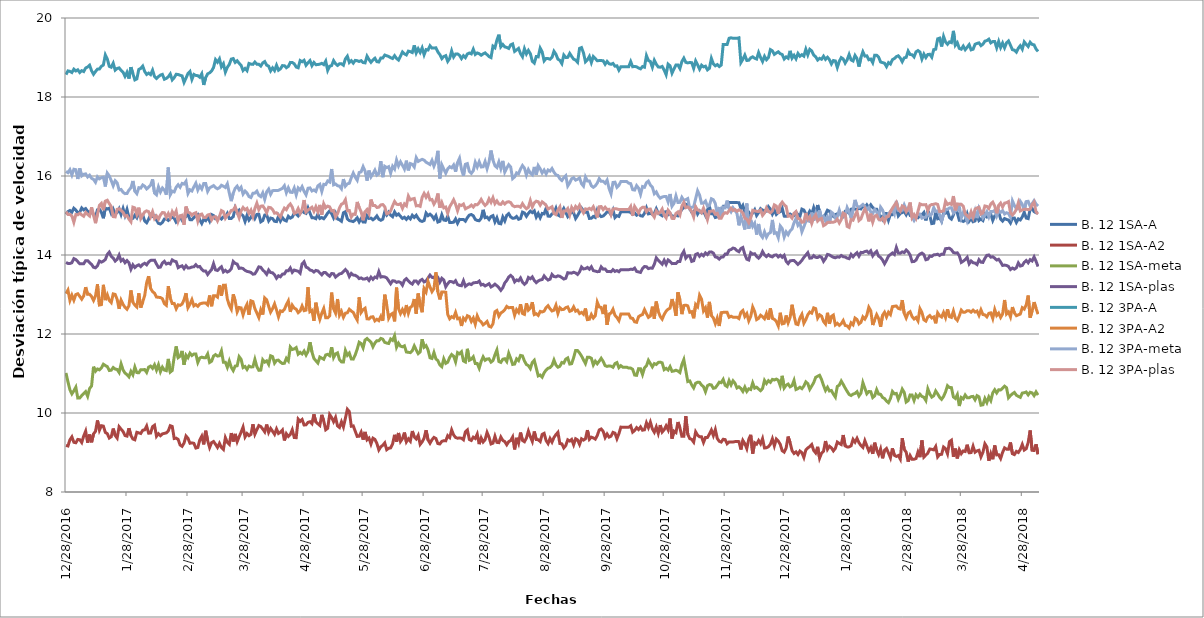
| Category | B. 12 1SA-A | B. 12 1SA-A2 | B. 12 1SA-meta | B. 12 1SA-plas | B. 12 3PA-A | B. 12 3PA-A2 | B. 12 3PA-meta | B. 12 3PA-plas |
|---|---|---|---|---|---|---|---|---|
| 28/12/2016 | 15.03 | 9.18 | 11.014 | 13.813 | 18.568 | 13.023 | 16.117 | 15.097 |
| 29/12/2016 | 15.1 | 9.165 | 10.789 | 13.787 | 18.661 | 13.112 | 16.084 | 15.027 |
| 30/12/2016 | 15.126 | 9.319 | 10.587 | 13.785 | 18.65 | 12.85 | 16.158 | 15.028 |
| 31/12/2016 | 15.083 | 9.395 | 10.484 | 13.805 | 18.62 | 12.982 | 16.026 | 14.99 |
| 01/01/2017 | 15.183 | 9.258 | 10.562 | 13.908 | 18.705 | 12.856 | 16.171 | 14.828 |
| 02/01/2017 | 15.139 | 9.247 | 10.653 | 13.883 | 18.659 | 13 | 16.16 | 15.024 |
| 03/01/2017 | 15.066 | 9.331 | 10.378 | 13.832 | 18.689 | 13.019 | 15.925 | 15.016 |
| 04/01/2017 | 15.085 | 9.324 | 10.381 | 13.778 | 18.619 | 12.952 | 16.193 | 15.057 |
| 05/01/2017 | 15.192 | 9.254 | 10.44 | 13.776 | 18.667 | 12.881 | 16.003 | 15.015 |
| 06/01/2017 | 15.142 | 9.416 | 10.491 | 13.778 | 18.644 | 12.964 | 16.042 | 14.981 |
| 07/01/2017 | 15.175 | 9.54 | 10.54 | 13.857 | 18.733 | 13.185 | 16.053 | 15.077 |
| 08/01/2017 | 15.107 | 9.248 | 10.423 | 13.855 | 18.76 | 13.004 | 15.976 | 15.027 |
| 09/01/2017 | 15.071 | 9.455 | 10.618 | 13.806 | 18.805 | 13.006 | 16.02 | 14.986 |
| 10/01/2017 | 15.12 | 9.258 | 10.686 | 13.762 | 18.665 | 12.95 | 15.942 | 15.208 |
| 11/01/2017 | 15.014 | 9.469 | 11.172 | 13.689 | 18.575 | 12.849 | 15.915 | 15.005 |
| 12/01/2017 | 14.963 | 9.536 | 11.058 | 13.675 | 18.645 | 12.964 | 15.842 | 14.806 |
| 13/01/2017 | 15.145 | 9.812 | 11.115 | 13.729 | 18.706 | 13.26 | 15.979 | 15.033 |
| 14/01/2017 | 15.158 | 9.564 | 11.092 | 13.848 | 18.709 | 12.733 | 15.929 | 15.255 |
| 15/01/2017 | 15.081 | 9.678 | 11.142 | 13.82 | 18.778 | 12.744 | 15.958 | 15.305 |
| 16/01/2017 | 14.93 | 9.668 | 11.234 | 13.846 | 18.809 | 13.245 | 15.97 | 15.135 |
| 17/01/2017 | 15.188 | 9.509 | 11.201 | 13.885 | 19.065 | 12.858 | 15.734 | 15.364 |
| 18/01/2017 | 15.165 | 9.476 | 11.175 | 14.014 | 18.964 | 12.993 | 16.073 | 15.386 |
| 19/01/2017 | 15.186 | 9.366 | 11.076 | 14.073 | 18.776 | 12.851 | 16.002 | 15.302 |
| 20/01/2017 | 15.054 | 9.399 | 11.084 | 13.965 | 18.753 | 12.796 | 15.884 | 15.224 |
| 21/01/2017 | 15.16 | 9.606 | 11.152 | 13.923 | 18.855 | 13.015 | 15.753 | 14.972 |
| 22/01/2017 | 15.033 | 9.432 | 11.112 | 13.846 | 18.68 | 13.002 | 15.88 | 14.965 |
| 23/01/2017 | 15.075 | 9.365 | 11.103 | 13.891 | 18.723 | 12.877 | 15.828 | 15.156 |
| 24/01/2017 | 15.17 | 9.652 | 11.027 | 13.997 | 18.737 | 12.636 | 15.646 | 15.171 |
| 25/01/2017 | 15.025 | 9.591 | 11.242 | 13.85 | 18.675 | 12.856 | 15.659 | 15.128 |
| 26/01/2017 | 15.177 | 9.531 | 11.092 | 13.889 | 18.628 | 12.751 | 15.588 | 15.083 |
| 27/01/2017 | 15.003 | 9.429 | 11.01 | 13.805 | 18.523 | 12.674 | 15.554 | 14.982 |
| 28/01/2017 | 15.154 | 9.415 | 10.972 | 13.859 | 18.625 | 12.626 | 15.555 | 14.999 |
| 29/01/2017 | 14.948 | 9.615 | 10.916 | 13.804 | 18.466 | 12.716 | 15.646 | 14.907 |
| 30/01/2017 | 14.908 | 9.431 | 11.054 | 13.64 | 18.754 | 13.103 | 15.699 | 14.841 |
| 31/01/2017 | 14.928 | 9.341 | 10.967 | 13.751 | 18.593 | 12.804 | 15.874 | 15.21 |
| 01/02/2017 | 15.007 | 9.322 | 11.163 | 13.683 | 18.432 | 12.732 | 15.615 | 15.193 |
| 02/02/2017 | 14.942 | 9.511 | 11.023 | 13.728 | 18.457 | 12.684 | 15.554 | 15.029 |
| 03/02/2017 | 15.068 | 9.497 | 11.018 | 13.751 | 18.697 | 13.031 | 15.705 | 15.199 |
| 04/02/2017 | 14.97 | 9.482 | 11.096 | 13.707 | 18.724 | 12.668 | 15.694 | 14.922 |
| 05/02/2017 | 15.016 | 9.563 | 11.097 | 13.763 | 18.783 | 12.813 | 15.773 | 15.01 |
| 06/02/2017 | 14.863 | 9.574 | 11.099 | 13.791 | 18.647 | 12.975 | 15.74 | 15.091 |
| 07/02/2017 | 14.816 | 9.67 | 11.027 | 13.751 | 18.571 | 13.302 | 15.672 | 15.117 |
| 08/02/2017 | 14.907 | 9.488 | 11.161 | 13.823 | 18.605 | 13.462 | 15.715 | 15.097 |
| 09/02/2017 | 15.022 | 9.493 | 11.188 | 13.864 | 18.567 | 13.156 | 15.765 | 14.967 |
| 10/02/2017 | 14.976 | 9.654 | 11.131 | 13.868 | 18.68 | 13.072 | 15.915 | 15.096 |
| 11/02/2017 | 14.997 | 9.69 | 11.221 | 13.87 | 18.52 | 13.034 | 15.568 | 14.922 |
| 12/02/2017 | 14.887 | 9.411 | 11.086 | 13.77 | 18.47 | 12.936 | 15.524 | 14.986 |
| 13/02/2017 | 14.8 | 9.476 | 11.221 | 13.685 | 18.516 | 12.929 | 15.725 | 14.905 |
| 14/02/2017 | 14.785 | 9.425 | 11.044 | 13.693 | 18.554 | 12.924 | 15.597 | 15.012 |
| 15/02/2017 | 14.824 | 9.472 | 11.16 | 13.796 | 18.573 | 12.894 | 15.697 | 15.076 |
| 16/02/2017 | 14.911 | 9.484 | 11.086 | 13.84 | 18.449 | 12.769 | 15.644 | 15.069 |
| 17/02/2017 | 14.908 | 9.497 | 11.072 | 13.772 | 18.472 | 12.727 | 15.527 | 14.954 |
| 18/02/2017 | 14.875 | 9.548 | 11.37 | 13.793 | 18.511 | 13.21 | 16.214 | 15.05 |
| 19/02/2017 | 14.93 | 9.679 | 11.036 | 13.772 | 18.582 | 12.908 | 15.525 | 14.943 |
| 20/02/2017 | 14.955 | 9.66 | 11.076 | 13.875 | 18.434 | 12.771 | 15.617 | 15.098 |
| 21/02/2017 | 14.933 | 9.354 | 11.424 | 13.844 | 18.49 | 12.774 | 15.597 | 15.009 |
| 22/02/2017 | 14.831 | 9.364 | 11.686 | 13.83 | 18.575 | 12.64 | 15.717 | 15.114 |
| 23/02/2017 | 14.874 | 9.331 | 11.402 | 13.68 | 18.57 | 12.739 | 15.779 | 14.857 |
| 24/02/2017 | 14.962 | 9.19 | 11.438 | 13.708 | 18.55 | 12.725 | 15.716 | 14.992 |
| 25/02/2017 | 14.88 | 9.156 | 11.571 | 13.726 | 18.535 | 12.757 | 15.812 | 15.009 |
| 26/02/2017 | 14.948 | 9.238 | 11.221 | 13.655 | 18.37 | 12.866 | 15.795 | 14.765 |
| 27/02/2017 | 14.973 | 9.417 | 11.464 | 13.728 | 18.48 | 13.033 | 15.865 | 15.226 |
| 28/02/2017 | 15.037 | 9.36 | 11.401 | 13.67 | 18.595 | 12.667 | 15.558 | 15.083 |
| 01/03/2017 | 14.895 | 9.234 | 11.514 | 13.675 | 18.647 | 12.755 | 15.651 | 15.065 |
| 02/03/2017 | 14.894 | 9.244 | 11.455 | 13.696 | 18.446 | 12.869 | 15.622 | 15.006 |
| 03/03/2017 | 14.946 | 9.233 | 11.492 | 13.702 | 18.572 | 12.711 | 15.724 | 15.051 |
| 04/03/2017 | 14.988 | 9.113 | 11.494 | 13.753 | 18.546 | 12.744 | 15.817 | 15.07 |
| 05/03/2017 | 15.024 | 9.126 | 11.28 | 13.7 | 18.539 | 12.702 | 15.645 | 14.858 |
| 06/03/2017 | 14.887 | 9.318 | 11.392 | 13.71 | 18.499 | 12.76 | 15.751 | 15.022 |
| 07/03/2017 | 14.798 | 9.412 | 11.414 | 13.636 | 18.588 | 12.777 | 15.672 | 15.037 |
| 08/03/2017 | 14.905 | 9.205 | 11.4 | 13.592 | 18.306 | 12.786 | 15.809 | 14.947 |
| 09/03/2017 | 14.87 | 9.551 | 11.4 | 13.592 | 18.491 | 12.786 | 15.809 | 14.947 |
| 10/03/2017 | 14.959 | 9.301 | 11.495 | 13.507 | 18.587 | 12.739 | 15.611 | 15.013 |
| 11/03/2017 | 14.858 | 9.126 | 11.279 | 13.573 | 18.612 | 12.975 | 15.7 | 15.027 |
| 12/03/2017 | 15.023 | 9.249 | 11.311 | 13.63 | 18.657 | 12.703 | 15.727 | 14.888 |
| 13/03/2017 | 14.999 | 9.278 | 11.442 | 13.779 | 18.748 | 12.967 | 15.756 | 14.962 |
| 14/03/2017 | 14.917 | 9.208 | 11.478 | 13.623 | 18.946 | 12.969 | 15.705 | 14.97 |
| 15/03/2017 | 14.92 | 9.128 | 11.441 | 13.608 | 18.882 | 12.933 | 15.677 | 14.864 |
| 16/03/2017 | 14.962 | 9.232 | 11.45 | 13.66 | 18.967 | 13.231 | 15.703 | 14.977 |
| 17/03/2017 | 14.912 | 9.125 | 11.575 | 13.702 | 18.765 | 12.972 | 15.766 | 15.125 |
| 18/03/2017 | 14.963 | 9.077 | 11.287 | 13.572 | 18.843 | 13.233 | 15.741 | 15.096 |
| 19/03/2017 | 14.96 | 9.376 | 11.286 | 13.612 | 18.63 | 13.236 | 15.71 | 14.932 |
| 20/03/2017 | 15.052 | 9.259 | 11.156 | 13.569 | 18.752 | 12.887 | 15.802 | 15.007 |
| 21/03/2017 | 14.923 | 9.207 | 11.315 | 13.594 | 18.824 | 12.726 | 15.567 | 15.049 |
| 22/03/2017 | 14.924 | 9.492 | 11.156 | 13.652 | 18.96 | 12.63 | 15.363 | 15.127 |
| 23/03/2017 | 14.97 | 9.279 | 11.073 | 13.837 | 18.973 | 13.004 | 15.566 | 15.139 |
| 24/03/2017 | 15.19 | 9.471 | 11.188 | 13.788 | 18.875 | 12.837 | 15.689 | 15.22 |
| 25/03/2017 | 15.081 | 9.274 | 11.197 | 13.77 | 18.917 | 12.56 | 15.744 | 15.076 |
| 26/03/2017 | 15.133 | 9.398 | 11.426 | 13.661 | 18.855 | 12.672 | 15.65 | 14.942 |
| 27/03/2017 | 15.033 | 9.514 | 11.359 | 13.671 | 18.8 | 12.661 | 15.715 | 15.119 |
| 28/03/2017 | 14.994 | 9.644 | 11.15 | 13.657 | 18.67 | 12.485 | 15.542 | 15.202 |
| 29/03/2017 | 14.849 | 9.395 | 11.178 | 13.611 | 18.722 | 12.647 | 15.617 | 15.144 |
| 30/03/2017 | 15.005 | 9.481 | 11.103 | 13.585 | 18.667 | 12.749 | 15.567 | 15.179 |
| 31/03/2017 | 14.884 | 9.426 | 11.188 | 13.575 | 18.849 | 12.487 | 15.48 | 15.052 |
| 01/04/2017 | 14.95 | 9.458 | 11.166 | 13.559 | 18.832 | 12.84 | 15.455 | 15.136 |
| 02/04/2017 | 15.044 | 9.714 | 11.169 | 13.513 | 18.826 | 12.82 | 15.562 | 14.979 |
| 03/04/2017 | 14.927 | 9.464 | 11.357 | 13.524 | 18.885 | 12.642 | 15.567 | 15.178 |
| 04/04/2017 | 15.028 | 9.579 | 11.174 | 13.603 | 18.83 | 12.532 | 15.618 | 15.312 |
| 05/04/2017 | 15.031 | 9.681 | 11.081 | 13.7 | 18.827 | 12.418 | 15.512 | 15.148 |
| 06/04/2017 | 14.839 | 9.657 | 11.086 | 13.69 | 18.784 | 12.614 | 15.478 | 15.236 |
| 07/04/2017 | 14.871 | 9.595 | 11.348 | 13.623 | 18.864 | 12.493 | 15.574 | 15.243 |
| 08/04/2017 | 15.011 | 9.522 | 11.287 | 13.574 | 18.897 | 12.913 | 15.408 | 15.171 |
| 09/04/2017 | 15.016 | 9.708 | 11.321 | 13.511 | 18.805 | 12.866 | 15.6 | 15.069 |
| 10/04/2017 | 14.864 | 9.508 | 11.232 | 13.62 | 18.78 | 12.703 | 15.668 | 15.208 |
| 11/04/2017 | 14.936 | 9.609 | 11.449 | 13.556 | 18.661 | 12.553 | 15.537 | 15.198 |
| 12/04/2017 | 14.922 | 9.536 | 11.428 | 13.55 | 18.737 | 12.642 | 15.629 | 15.152 |
| 13/04/2017 | 14.853 | 9.461 | 11.263 | 13.5 | 18.669 | 12.762 | 15.634 | 15.058 |
| 14/04/2017 | 14.846 | 9.596 | 11.332 | 13.411 | 18.804 | 12.61 | 15.634 | 15.069 |
| 15/04/2017 | 14.983 | 9.482 | 11.339 | 13.474 | 18.678 | 12.434 | 15.636 | 15.02 |
| 16/04/2017 | 14.859 | 9.514 | 11.288 | 13.449 | 18.714 | 12.585 | 15.662 | 14.96 |
| 17/04/2017 | 14.947 | 9.569 | 11.252 | 13.515 | 18.794 | 12.57 | 15.687 | 15.092 |
| 18/04/2017 | 14.883 | 9.305 | 11.259 | 13.521 | 18.793 | 12.622 | 15.753 | 15.187 |
| 19/04/2017 | 14.862 | 9.476 | 11.385 | 13.599 | 18.741 | 12.742 | 15.576 | 15.147 |
| 20/04/2017 | 14.981 | 9.407 | 11.321 | 13.6 | 18.774 | 12.838 | 15.7 | 15.24 |
| 21/04/2017 | 14.932 | 9.456 | 11.67 | 13.672 | 18.876 | 12.56 | 15.59 | 15.293 |
| 22/04/2017 | 14.96 | 9.575 | 11.608 | 13.561 | 18.874 | 12.73 | 15.583 | 15.212 |
| 23/04/2017 | 15.06 | 9.378 | 11.622 | 13.619 | 18.84 | 12.655 | 15.697 | 15.053 |
| 24/04/2017 | 15.038 | 9.376 | 11.656 | 13.603 | 18.759 | 12.629 | 15.521 | 15.075 |
| 25/04/2017 | 14.987 | 9.846 | 11.489 | 13.588 | 18.74 | 12.54 | 15.697 | 15.175 |
| 26/04/2017 | 15.052 | 9.789 | 11.535 | 13.54 | 18.923 | 12.583 | 15.642 | 15.051 |
| 27/04/2017 | 15.118 | 9.835 | 11.495 | 13.777 | 18.893 | 12.71 | 15.731 | 15.149 |
| 28/04/2017 | 15.073 | 9.697 | 11.567 | 13.828 | 18.929 | 12.591 | 15.612 | 15.391 |
| 29/04/2017 | 15.053 | 9.701 | 11.467 | 13.694 | 18.804 | 12.605 | 15.524 | 15.089 |
| 30/04/2017 | 15.191 | 9.763 | 11.559 | 13.672 | 18.867 | 13.184 | 15.689 | 15.141 |
| 01/05/2017 | 15.061 | 9.78 | 11.792 | 13.619 | 18.921 | 12.565 | 15.699 | 15.17 |
| 02/05/2017 | 14.943 | 9.73 | 11.545 | 13.607 | 18.793 | 12.596 | 15.62 | 15.209 |
| 03/05/2017 | 14.942 | 9.966 | 11.382 | 13.568 | 18.875 | 12.334 | 15.647 | 15.106 |
| 04/05/2017 | 14.919 | 9.772 | 11.322 | 13.61 | 18.818 | 12.792 | 15.611 | 15.223 |
| 05/05/2017 | 15.036 | 9.727 | 11.265 | 13.596 | 18.821 | 12.544 | 15.75 | 15.096 |
| 06/05/2017 | 14.925 | 9.685 | 11.416 | 13.546 | 18.832 | 12.369 | 15.788 | 15.268 |
| 07/05/2017 | 14.949 | 9.954 | 11.388 | 13.497 | 18.853 | 12.526 | 15.609 | 15.018 |
| 08/05/2017 | 14.918 | 9.796 | 11.36 | 13.557 | 18.819 | 12.646 | 15.789 | 15.298 |
| 09/05/2017 | 14.982 | 9.575 | 11.469 | 13.554 | 18.909 | 12.412 | 15.782 | 15.197 |
| 10/05/2017 | 15.062 | 9.613 | 11.485 | 13.498 | 18.674 | 12.409 | 15.874 | 15.237 |
| 11/05/2017 | 15.116 | 9.96 | 11.451 | 13.463 | 18.78 | 12.458 | 15.847 | 15.22 |
| 12/05/2017 | 15.047 | 9.886 | 11.664 | 13.531 | 18.795 | 13.048 | 16.177 | 15.117 |
| 13/05/2017 | 14.94 | 9.78 | 11.403 | 13.526 | 18.921 | 12.639 | 15.776 | 15.128 |
| 14/05/2017 | 15.055 | 9.889 | 11.496 | 13.441 | 18.843 | 12.529 | 15.797 | 14.964 |
| 15/05/2017 | 14.913 | 9.673 | 11.522 | 13.482 | 18.799 | 12.885 | 15.754 | 15.044 |
| 16/05/2017 | 14.89 | 9.634 | 11.352 | 13.522 | 18.841 | 12.475 | 15.743 | 15.192 |
| 17/05/2017 | 14.855 | 9.776 | 11.294 | 13.533 | 18.841 | 12.571 | 15.677 | 15.287 |
| 18/05/2017 | 15.068 | 9.647 | 11.29 | 13.58 | 18.805 | 12.423 | 15.921 | 15.309 |
| 19/05/2017 | 15.097 | 9.867 | 11.583 | 13.632 | 18.965 | 12.526 | 15.742 | 15.4 |
| 20/05/2017 | 14.914 | 10.094 | 11.461 | 13.577 | 19.033 | 12.537 | 15.801 | 15.121 |
| 21/05/2017 | 14.871 | 10.035 | 11.518 | 13.454 | 18.874 | 12.627 | 15.816 | 15.127 |
| 22/05/2017 | 14.86 | 9.665 | 11.369 | 13.533 | 18.921 | 12.581 | 15.957 | 14.961 |
| 23/05/2017 | 14.846 | 9.674 | 11.365 | 13.491 | 18.858 | 12.548 | 16.075 | 15.036 |
| 24/05/2017 | 14.885 | 9.539 | 11.471 | 13.485 | 18.927 | 12.442 | 15.971 | 15.027 |
| 25/05/2017 | 14.942 | 9.407 | 11.616 | 13.456 | 18.919 | 12.355 | 15.893 | 15.343 |
| 26/05/2017 | 14.837 | 9.412 | 11.792 | 13.403 | 18.898 | 12.928 | 16.089 | 15.205 |
| 27/05/2017 | 14.92 | 9.514 | 11.759 | 13.419 | 18.92 | 12.546 | 16.106 | 15.096 |
| 28/05/2017 | 14.835 | 9.326 | 11.647 | 13.39 | 18.873 | 12.618 | 16.236 | 14.879 |
| 29/05/2017 | 14.832 | 9.521 | 11.848 | 13.395 | 18.864 | 12.653 | 16.126 | 15.096 |
| 30/05/2017 | 14.994 | 9.321 | 11.886 | 13.417 | 19.034 | 12.385 | 15.883 | 15.151 |
| 31/05/2017 | 14.926 | 9.365 | 11.839 | 13.356 | 18.948 | 12.38 | 16.138 | 15.049 |
| 01/06/2017 | 14.934 | 9.215 | 11.795 | 13.439 | 18.879 | 12.429 | 15.978 | 15.405 |
| 02/06/2017 | 14.891 | 9.363 | 11.676 | 13.384 | 18.937 | 12.436 | 16.056 | 15.255 |
| 03/06/2017 | 14.928 | 9.332 | 11.771 | 13.442 | 18.982 | 12.332 | 16.148 | 15.254 |
| 04/06/2017 | 14.989 | 9.23 | 11.832 | 13.421 | 18.895 | 12.372 | 16.022 | 15.203 |
| 05/06/2017 | 14.906 | 9.065 | 11.831 | 13.579 | 18.886 | 12.338 | 16.059 | 15.211 |
| 06/06/2017 | 14.879 | 9.145 | 11.889 | 13.441 | 18.989 | 12.444 | 16.374 | 15.269 |
| 07/06/2017 | 14.906 | 9.183 | 11.869 | 13.453 | 18.988 | 12.337 | 15.971 | 15.277 |
| 08/06/2017 | 15.091 | 9.243 | 11.788 | 13.445 | 19.062 | 12.996 | 16.245 | 15.224 |
| 09/06/2017 | 15.011 | 9.07 | 11.77 | 13.42 | 19.044 | 12.741 | 16.212 | 15.042 |
| 10/06/2017 | 15.084 | 9.106 | 11.76 | 13.348 | 19.026 | 12.399 | 16.237 | 15.062 |
| 11/06/2017 | 15.009 | 9.117 | 11.874 | 13.272 | 18.995 | 12.491 | 16.07 | 15.114 |
| 12/06/2017 | 14.969 | 9.22 | 11.839 | 13.347 | 18.974 | 12.523 | 16.247 | 15.244 |
| 13/06/2017 | 15.09 | 9.448 | 11.956 | 13.343 | 19.046 | 12.322 | 16.177 | 15.355 |
| 14/06/2017 | 15.006 | 9.274 | 11.664 | 13.307 | 18.975 | 13.173 | 16.405 | 15.286 |
| 15/06/2017 | 15.039 | 9.494 | 11.768 | 13.323 | 18.935 | 12.643 | 16.255 | 15.276 |
| 16/06/2017 | 14.979 | 9.278 | 11.693 | 13.306 | 19.035 | 12.517 | 16.359 | 15.298 |
| 17/06/2017 | 14.926 | 9.351 | 11.676 | 13.236 | 19.14 | 12.618 | 16.272 | 15.181 |
| 18/06/2017 | 14.955 | 9.505 | 11.701 | 13.361 | 19.093 | 12.515 | 16.177 | 15.292 |
| 19/06/2017 | 14.901 | 9.269 | 11.544 | 13.402 | 19.065 | 12.732 | 16.389 | 15.246 |
| 20/06/2017 | 14.961 | 9.347 | 11.537 | 13.343 | 19.162 | 12.524 | 16.142 | 15.491 |
| 21/06/2017 | 14.913 | 9.285 | 11.529 | 13.296 | 19.148 | 12.67 | 16.315 | 15.395 |
| 22/06/2017 | 15.006 | 9.544 | 11.577 | 13.264 | 19.125 | 12.717 | 16.295 | 15.419 |
| 23/06/2017 | 14.95 | 9.395 | 11.698 | 13.344 | 19.307 | 12.886 | 16.228 | 15.431 |
| 24/06/2017 | 15.006 | 9.345 | 11.596 | 13.341 | 19.115 | 12.513 | 16.465 | 15.245 |
| 25/06/2017 | 14.926 | 9.435 | 11.503 | 13.279 | 19.22 | 13.025 | 16.369 | 15.252 |
| 26/06/2017 | 14.868 | 9.205 | 11.547 | 13.352 | 19.129 | 12.728 | 16.398 | 15.232 |
| 27/06/2017 | 14.851 | 9.269 | 11.867 | 13.382 | 19.244 | 12.551 | 16.422 | 15.456 |
| 28/06/2017 | 14.872 | 9.362 | 11.665 | 13.318 | 19.07 | 13.15 | 16.4 | 15.559 |
| 29/06/2017 | 15.062 | 9.564 | 11.705 | 13.339 | 19.201 | 13.064 | 16.349 | 15.461 |
| 30/06/2017 | 14.996 | 9.317 | 11.599 | 13.418 | 19.19 | 13.331 | 16.321 | 15.551 |
| 01/07/2017 | 15.034 | 9.235 | 11.397 | 13.491 | 19.296 | 13.191 | 16.291 | 15.395 |
| 02/07/2017 | 14.989 | 9.322 | 11.38 | 13.435 | 19.238 | 13.073 | 16.395 | 15.404 |
| 03/07/2017 | 14.911 | 9.382 | 11.532 | 13.424 | 19.239 | 13.15 | 16.249 | 15.287 |
| 04/07/2017 | 14.996 | 9.354 | 11.371 | 13.495 | 19.246 | 13.561 | 16.374 | 15.373 |
| 05/07/2017 | 14.835 | 9.225 | 11.325 | 13.434 | 19.14 | 13.067 | 16.637 | 15.556 |
| 06/07/2017 | 14.853 | 9.217 | 11.218 | 13.313 | 19.074 | 12.876 | 15.938 | 15.197 |
| 07/07/2017 | 15.018 | 9.281 | 11.172 | 13.411 | 18.972 | 13.065 | 16.283 | 15.328 |
| 08/07/2017 | 14.886 | 9.299 | 11.37 | 13.368 | 19.024 | 13.065 | 16.174 | 15.193 |
| 09/07/2017 | 14.875 | 9.295 | 11.256 | 13.195 | 19.046 | 13.056 | 16.07 | 15.213 |
| 10/07/2017 | 14.981 | 9.427 | 11.286 | 13.273 | 18.902 | 12.496 | 16.181 | 15.058 |
| 11/07/2017 | 14.824 | 9.378 | 11.408 | 13.33 | 18.975 | 12.386 | 16.235 | 15.223 |
| 12/07/2017 | 14.822 | 9.571 | 11.481 | 13.325 | 19.166 | 12.44 | 16.207 | 15.304 |
| 13/07/2017 | 14.831 | 9.445 | 11.438 | 13.3 | 19.012 | 12.41 | 16.278 | 15.398 |
| 14/07/2017 | 14.914 | 9.379 | 11.296 | 13.349 | 19.088 | 12.545 | 16.11 | 15.285 |
| 15/07/2017 | 14.801 | 9.362 | 11.53 | 13.252 | 19.091 | 12.386 | 16.341 | 15.121 |
| 16/07/2017 | 14.902 | 9.367 | 11.498 | 13.231 | 19.056 | 12.403 | 16.45 | 15.272 |
| 17/07/2017 | 14.9 | 9.362 | 11.548 | 13.222 | 18.973 | 12.203 | 16.169 | 15.253 |
| 18/07/2017 | 14.9 | 9.323 | 11.318 | 13.347 | 19.047 | 12.402 | 16.007 | 15.289 |
| 19/07/2017 | 14.857 | 9.524 | 11.291 | 13.207 | 18.998 | 12.348 | 16.297 | 15.169 |
| 20/07/2017 | 14.946 | 9.57 | 11.625 | 13.246 | 19.089 | 12.462 | 16.314 | 15.197 |
| 21/07/2017 | 15.01 | 9.33 | 11.335 | 13.271 | 19.113 | 12.44 | 16.115 | 15.219 |
| 22/07/2017 | 15.024 | 9.306 | 11.362 | 13.251 | 19.091 | 12.317 | 16.067 | 15.262 |
| 23/07/2017 | 14.993 | 9.388 | 11.423 | 13.294 | 19.21 | 12.404 | 16.133 | 15.214 |
| 24/07/2017 | 14.901 | 9.355 | 11.254 | 13.301 | 19.077 | 12.248 | 16.348 | 15.277 |
| 25/07/2017 | 14.875 | 9.465 | 11.254 | 13.302 | 19.115 | 12.461 | 16.229 | 15.272 |
| 26/07/2017 | 14.867 | 9.212 | 11.134 | 13.34 | 19.096 | 12.348 | 16.361 | 15.324 |
| 27/07/2017 | 14.931 | 9.37 | 11.305 | 13.241 | 19.057 | 12.307 | 16.23 | 15.406 |
| 28/07/2017 | 15.144 | 9.266 | 11.422 | 13.258 | 19.092 | 12.232 | 16.231 | 15.318 |
| 29/07/2017 | 14.945 | 9.324 | 11.334 | 13.216 | 19.117 | 12.27 | 16.367 | 15.254 |
| 30/07/2017 | 14.96 | 9.508 | 11.368 | 13.243 | 19.072 | 12.317 | 16.186 | 15.3 |
| 31/07/2017 | 14.899 | 9.387 | 11.371 | 13.273 | 19.024 | 12.196 | 16.357 | 15.423 |
| 01/08/2017 | 14.975 | 9.217 | 11.288 | 13.191 | 18.998 | 12.176 | 16.645 | 15.333 |
| 02/08/2017 | 14.997 | 9.236 | 11.327 | 13.22 | 19.287 | 12.26 | 16.402 | 15.451 |
| 03/08/2017 | 14.838 | 9.411 | 11.472 | 13.262 | 19.247 | 12.564 | 16.262 | 15.301 |
| 04/08/2017 | 14.943 | 9.256 | 11.596 | 13.222 | 19.44 | 12.596 | 16.215 | 15.37 |
| 05/08/2017 | 14.801 | 9.25 | 11.303 | 13.172 | 19.577 | 12.449 | 16.358 | 15.291 |
| 06/08/2017 | 14.789 | 9.391 | 11.281 | 13.106 | 19.271 | 12.533 | 16.19 | 15.281 |
| 07/08/2017 | 14.961 | 9.306 | 11.362 | 13.172 | 19.33 | 12.564 | 16.383 | 15.344 |
| 08/08/2017 | 14.862 | 9.276 | 11.374 | 13.294 | 19.269 | 12.616 | 16.099 | 15.29 |
| 09/08/2017 | 15.004 | 9.196 | 11.303 | 13.354 | 19.256 | 12.698 | 16.201 | 15.338 |
| 10/08/2017 | 15.048 | 9.275 | 11.512 | 13.442 | 19.229 | 12.662 | 16.285 | 15.349 |
| 11/08/2017 | 14.965 | 9.302 | 11.382 | 13.484 | 19.32 | 12.673 | 16.228 | 15.327 |
| 12/08/2017 | 14.929 | 9.392 | 11.23 | 13.437 | 19.344 | 12.671 | 15.934 | 15.25 |
| 13/08/2017 | 14.934 | 9.078 | 11.239 | 13.321 | 19.154 | 12.472 | 15.978 | 15.223 |
| 14/08/2017 | 14.974 | 9.371 | 11.371 | 13.369 | 19.191 | 12.615 | 16.08 | 15.233 |
| 15/08/2017 | 14.905 | 9.235 | 11.325 | 13.347 | 19.231 | 12.549 | 16.057 | 15.234 |
| 16/08/2017 | 14.923 | 9.505 | 11.458 | 13.419 | 19.099 | 12.754 | 16.176 | 15.21 |
| 17/08/2017 | 15.086 | 9.304 | 11.446 | 13.313 | 19.019 | 12.52 | 16.265 | 15.301 |
| 18/08/2017 | 15.065 | 9.273 | 11.317 | 13.258 | 19.223 | 12.497 | 16.199 | 15.224 |
| 19/08/2017 | 14.98 | 9.365 | 11.227 | 13.301 | 19.09 | 12.776 | 16.023 | 15.172 |
| 20/08/2017 | 15.055 | 9.542 | 11.199 | 13.431 | 19.179 | 12.604 | 16.163 | 15.208 |
| 21/08/2017 | 15.111 | 9.4 | 11.125 | 13.398 | 19.097 | 12.654 | 16.074 | 15.377 |
| 22/08/2017 | 15.073 | 9.28 | 11.282 | 13.444 | 18.903 | 12.805 | 16.031 | 15.216 |
| 23/08/2017 | 15.118 | 9.531 | 11.334 | 13.355 | 18.859 | 12.492 | 16.229 | 15.321 |
| 24/08/2017 | 14.96 | 9.327 | 11.14 | 13.3 | 19.024 | 12.512 | 16.031 | 15.362 |
| 25/08/2017 | 15.051 | 9.325 | 10.94 | 13.342 | 19.017 | 12.471 | 16.262 | 15.349 |
| 26/08/2017 | 14.942 | 9.277 | 10.961 | 13.368 | 19.238 | 12.573 | 16.183 | 15.263 |
| 27/08/2017 | 15.052 | 9.458 | 10.907 | 13.378 | 19.143 | 12.557 | 16.076 | 15.345 |
| 28/08/2017 | 15.041 | 9.484 | 11.018 | 13.47 | 18.914 | 12.579 | 16.15 | 15.307 |
| 29/08/2017 | 15.184 | 9.302 | 11.088 | 13.41 | 18.976 | 12.67 | 16.053 | 15.257 |
| 30/08/2017 | 14.985 | 9.226 | 11.132 | 13.366 | 18.973 | 12.716 | 16.152 | 15.163 |
| 31/08/2017 | 14.98 | 9.355 | 11.149 | 13.386 | 18.956 | 12.639 | 16.123 | 15.192 |
| 01/09/2017 | 15.04 | 9.264 | 11.202 | 13.509 | 19.004 | 12.583 | 16.19 | 15.221 |
| 02/09/2017 | 15.065 | 9.381 | 11.341 | 13.456 | 19.157 | 12.603 | 16.097 | 15.049 |
| 03/09/2017 | 15.185 | 9.453 | 11.215 | 13.446 | 19.082 | 12.728 | 16.029 | 15.023 |
| 04/09/2017 | 15.015 | 9.51 | 11.16 | 13.472 | 18.957 | 12.522 | 16.014 | 15.136 |
| 05/09/2017 | 14.985 | 9.226 | 11.184 | 13.461 | 18.928 | 12.665 | 15.931 | 15.218 |
| 06/09/2017 | 15.09 | 9.218 | 11.279 | 13.428 | 18.846 | 12.617 | 15.886 | 14.939 |
| 07/09/2017 | 15.18 | 9.117 | 11.264 | 13.392 | 19.062 | 12.624 | 15.958 | 15.117 |
| 08/09/2017 | 15.079 | 9.177 | 11.364 | 13.41 | 18.999 | 12.667 | 16.008 | 15.117 |
| 09/09/2017 | 14.974 | 9.321 | 11.395 | 13.552 | 19.003 | 12.684 | 15.747 | 15.176 |
| 10/09/2017 | 15.045 | 9.29 | 11.24 | 13.542 | 19.105 | 12.574 | 15.825 | 15.016 |
| 11/09/2017 | 15.08 | 9.33 | 11.25 | 13.541 | 19.027 | 12.595 | 15.932 | 15.204 |
| 12/09/2017 | 15.068 | 9.197 | 11.401 | 13.563 | 18.957 | 12.686 | 15.958 | 15.118 |
| 13/09/2017 | 14.925 | 9.348 | 11.584 | 13.545 | 18.934 | 12.578 | 15.895 | 15.229 |
| 14/09/2017 | 15 | 9.319 | 11.581 | 13.508 | 18.879 | 12.603 | 15.917 | 15.169 |
| 15/09/2017 | 15.091 | 9.205 | 11.52 | 13.572 | 19.231 | 12.518 | 15.953 | 15.26 |
| 16/09/2017 | 15.189 | 9.346 | 11.443 | 13.696 | 19.251 | 12.548 | 15.805 | 15.143 |
| 17/09/2017 | 15.119 | 9.313 | 11.346 | 13.646 | 19.117 | 12.5 | 15.745 | 15.065 |
| 18/09/2017 | 15.081 | 9.347 | 11.252 | 13.656 | 18.892 | 12.646 | 15.974 | 15.168 |
| 19/09/2017 | 15.086 | 9.566 | 11.412 | 13.685 | 18.942 | 12.363 | 15.872 | 15.153 |
| 20/09/2017 | 14.927 | 9.334 | 11.41 | 13.639 | 19.027 | 12.372 | 15.874 | 15.182 |
| 21/09/2017 | 14.93 | 9.388 | 11.386 | 13.701 | 18.873 | 12.494 | 15.753 | 15.149 |
| 22/09/2017 | 14.976 | 9.37 | 11.217 | 13.605 | 19.025 | 12.404 | 15.714 | 15.222 |
| 23/09/2017 | 14.951 | 9.339 | 11.312 | 13.592 | 18.972 | 12.463 | 15.75 | 15.105 |
| 24/09/2017 | 15.135 | 9.429 | 11.247 | 13.578 | 18.919 | 12.807 | 15.82 | 14.951 |
| 25/09/2017 | 15.024 | 9.571 | 11.312 | 13.58 | 18.922 | 12.685 | 15.934 | 15.221 |
| 26/09/2017 | 14.972 | 9.596 | 11.385 | 13.699 | 18.923 | 12.673 | 15.864 | 15.227 |
| 27/09/2017 | 14.987 | 9.535 | 11.308 | 13.642 | 18.917 | 12.506 | 15.866 | 15.15 |
| 28/09/2017 | 15.032 | 9.379 | 11.199 | 13.646 | 18.829 | 12.738 | 15.816 | 15.209 |
| 29/09/2017 | 15.092 | 9.468 | 11.18 | 13.585 | 18.901 | 12.231 | 15.897 | 15.15 |
| 30/09/2017 | 15.088 | 9.39 | 11.193 | 13.584 | 18.842 | 12.506 | 15.684 | 15.157 |
| 01/10/2017 | 15.021 | 9.414 | 11.185 | 13.577 | 18.828 | 12.53 | 15.549 | 15.02 |
| 02/10/2017 | 15.139 | 9.51 | 11.158 | 13.63 | 18.85 | 12.626 | 15.836 | 15.166 |
| 03/10/2017 | 14.946 | 9.489 | 11.25 | 13.584 | 18.78 | 12.474 | 15.843 | 15.173 |
| 04/10/2017 | 14.995 | 9.349 | 11.277 | 13.606 | 18.79 | 12.416 | 15.716 | 15.167 |
| 05/10/2017 | 14.977 | 9.476 | 11.147 | 13.576 | 18.68 | 12.339 | 15.765 | 15.149 |
| 06/10/2017 | 15.096 | 9.643 | 11.198 | 13.627 | 18.767 | 12.506 | 15.858 | 15.151 |
| 07/10/2017 | 15.096 | 9.638 | 11.16 | 13.627 | 18.767 | 12.506 | 15.858 | 15.151 |
| 08/10/2017 | 15.096 | 9.638 | 11.16 | 13.627 | 18.767 | 12.506 | 15.858 | 15.151 |
| 09/10/2017 | 15.096 | 9.638 | 11.16 | 13.627 | 18.767 | 12.506 | 15.858 | 15.151 |
| 10/10/2017 | 15.096 | 9.639 | 11.136 | 13.627 | 18.767 | 12.506 | 15.818 | 15.151 |
| 11/10/2017 | 15.076 | 9.677 | 11.137 | 13.639 | 18.896 | 12.403 | 15.807 | 15.23 |
| 12/10/2017 | 15.029 | 9.515 | 11.105 | 13.633 | 18.766 | 12.395 | 15.654 | 14.997 |
| 13/10/2017 | 15.064 | 9.556 | 10.96 | 13.668 | 18.774 | 12.308 | 15.644 | 15.229 |
| 14/10/2017 | 15.007 | 9.629 | 10.953 | 13.584 | 18.764 | 12.296 | 15.757 | 15.15 |
| 15/10/2017 | 15.038 | 9.582 | 11.123 | 13.572 | 18.734 | 12.438 | 15.693 | 15.063 |
| 16/10/2017 | 14.995 | 9.648 | 11.12 | 13.559 | 18.713 | 12.472 | 15.536 | 15.17 |
| 17/10/2017 | 14.983 | 9.564 | 10.975 | 13.658 | 18.77 | 12.493 | 15.733 | 15.208 |
| 18/10/2017 | 15.053 | 9.575 | 11.142 | 13.709 | 18.753 | 12.616 | 15.715 | 15.207 |
| 19/10/2017 | 15.19 | 9.751 | 11.193 | 13.702 | 19.047 | 12.515 | 15.831 | 15.095 |
| 20/10/2017 | 15.041 | 9.63 | 11.334 | 13.656 | 18.924 | 12.421 | 15.87 | 15.158 |
| 21/10/2017 | 15.057 | 9.769 | 11.25 | 13.669 | 18.899 | 12.455 | 15.767 | 15.164 |
| 22/10/2017 | 15.03 | 9.598 | 11.167 | 13.665 | 18.752 | 12.692 | 15.72 | 15.031 |
| 23/10/2017 | 15.054 | 9.513 | 11.25 | 13.764 | 18.929 | 12.39 | 15.551 | 14.959 |
| 24/10/2017 | 15.17 | 9.646 | 11.229 | 13.929 | 18.83 | 12.821 | 15.599 | 15.119 |
| 25/10/2017 | 15.057 | 9.485 | 11.281 | 13.864 | 18.76 | 12.572 | 15.498 | 15.051 |
| 26/10/2017 | 15.027 | 9.693 | 11.288 | 13.817 | 18.754 | 12.445 | 15.438 | 15.08 |
| 27/10/2017 | 14.994 | 9.518 | 11.27 | 13.767 | 18.774 | 12.376 | 15.468 | 15.163 |
| 28/10/2017 | 15.086 | 9.576 | 11.096 | 13.868 | 18.682 | 12.495 | 15.482 | 15.006 |
| 29/10/2017 | 15.096 | 9.673 | 11.13 | 13.764 | 18.566 | 12.577 | 15.482 | 14.941 |
| 30/10/2017 | 15.018 | 9.575 | 11.089 | 13.874 | 18.832 | 12.627 | 15.345 | 15.133 |
| 31/10/2017 | 15.053 | 9.861 | 11.174 | 13.837 | 18.789 | 12.654 | 15.544 | 15.068 |
| 01/11/2017 | 14.983 | 9.353 | 11.055 | 13.782 | 18.605 | 12.884 | 15.236 | 14.927 |
| 02/11/2017 | 14.983 | 9.541 | 11.064 | 13.782 | 18.713 | 12.713 | 15.31 | 14.925 |
| 03/11/2017 | 15.004 | 9.505 | 11.084 | 13.782 | 18.81 | 12.459 | 15.497 | 15.053 |
| 04/11/2017 | 14.991 | 9.771 | 11.062 | 13.837 | 18.811 | 13.056 | 15.329 | 15.09 |
| 05/11/2017 | 15.073 | 9.622 | 11.024 | 13.836 | 18.721 | 12.865 | 15.333 | 15.01 |
| 06/11/2017 | 15.156 | 9.409 | 11.226 | 14.009 | 18.897 | 12.503 | 15.46 | 15.235 |
| 07/11/2017 | 15.199 | 9.409 | 11.351 | 14.094 | 18.984 | 12.723 | 15.382 | 15.332 |
| 08/11/2017 | 15.286 | 9.924 | 11.076 | 13.92 | 18.877 | 12.73 | 15.401 | 15.198 |
| 09/11/2017 | 15.268 | 9.458 | 10.796 | 13.976 | 18.863 | 12.713 | 15.428 | 15.218 |
| 10/11/2017 | 15.175 | 9.354 | 10.812 | 13.981 | 18.873 | 12.55 | 15.182 | 15.177 |
| 11/11/2017 | 15.081 | 9.33 | 10.711 | 13.838 | 18.869 | 12.566 | 15.207 | 15.099 |
| 12/11/2017 | 15.064 | 9.263 | 10.634 | 13.854 | 18.725 | 12.398 | 15.221 | 14.963 |
| 13/11/2017 | 15.189 | 9.522 | 10.754 | 14.013 | 18.913 | 12.748 | 15.427 | 15.218 |
| 14/11/2017 | 15.038 | 9.437 | 10.779 | 14.036 | 18.814 | 12.691 | 15.624 | 15.144 |
| 15/11/2017 | 15.118 | 9.398 | 10.775 | 13.967 | 18.705 | 12.981 | 15.517 | 15.115 |
| 16/11/2017 | 15.066 | 9.397 | 10.707 | 14.018 | 18.806 | 12.88 | 15.31 | 15.068 |
| 17/11/2017 | 15.104 | 9.254 | 10.666 | 13.98 | 18.762 | 12.585 | 15.312 | 15.187 |
| 18/11/2017 | 15.001 | 9.38 | 10.539 | 14.053 | 18.78 | 12.663 | 15.366 | 15.053 |
| 19/11/2017 | 15.141 | 9.38 | 10.691 | 14.012 | 18.687 | 12.415 | 15.235 | 14.896 |
| 20/11/2017 | 15.228 | 9.466 | 10.72 | 14.075 | 18.726 | 12.813 | 15.257 | 15.102 |
| 21/11/2017 | 15.046 | 9.567 | 10.71 | 14.079 | 18.977 | 12.465 | 15.424 | 15.109 |
| 22/11/2017 | 15.049 | 9.428 | 10.625 | 14.048 | 18.84 | 12.409 | 15.4 | 15.121 |
| 23/11/2017 | 14.95 | 9.58 | 10.638 | 13.951 | 18.79 | 12.262 | 15.302 | 15.032 |
| 24/11/2017 | 14.965 | 9.355 | 10.702 | 13.941 | 18.82 | 12.405 | 15.041 | 15.054 |
| 25/11/2017 | 15.002 | 9.283 | 10.78 | 13.896 | 18.771 | 12.203 | 15.214 | 14.932 |
| 26/11/2017 | 15.06 | 9.264 | 10.767 | 13.946 | 18.809 | 12.54 | 14.94 | 14.932 |
| 27/11/2017 | 15.232 | 9.335 | 10.85 | 13.952 | 19.328 | 12.548 | 15.212 | 15.034 |
| 28/11/2017 | 15.235 | 9.327 | 10.701 | 14.024 | 19.328 | 12.548 | 15.196 | 15.072 |
| 29/11/2017 | 15.235 | 9.222 | 10.668 | 14.02 | 19.328 | 12.548 | 15.378 | 15.057 |
| 30/11/2017 | 15.329 | 9.268 | 10.82 | 14.121 | 19.486 | 12.425 | 15.176 | 15.124 |
| 01/12/2017 | 15.329 | 9.266 | 10.711 | 14.138 | 19.499 | 12.45 | 15.093 | 15.186 |
| 02/12/2017 | 15.329 | 9.266 | 10.816 | 14.176 | 19.486 | 12.425 | 15.197 | 15.128 |
| 03/12/2017 | 15.33 | 9.276 | 10.754 | 14.161 | 19.486 | 12.425 | 15.128 | 15.151 |
| 04/12/2017 | 15.327 | 9.28 | 10.634 | 14.111 | 19.486 | 12.425 | 15.054 | 15.108 |
| 05/12/2017 | 15.324 | 9.275 | 10.663 | 14.084 | 19.499 | 12.392 | 14.751 | 15.143 |
| 06/12/2017 | 15.174 | 9.076 | 10.621 | 14.163 | 18.872 | 12.55 | 14.97 | 15.121 |
| 07/12/2017 | 15.255 | 9.304 | 10.547 | 14.189 | 18.954 | 12.596 | 14.823 | 15.061 |
| 08/12/2017 | 15.084 | 9.225 | 10.657 | 14.013 | 19.06 | 12.443 | 14.646 | 14.93 |
| 09/12/2017 | 15.075 | 9.099 | 10.546 | 13.893 | 18.925 | 12.517 | 15.303 | 14.91 |
| 10/12/2017 | 15.084 | 9.335 | 10.612 | 13.873 | 18.93 | 12.332 | 14.667 | 14.819 |
| 11/12/2017 | 14.987 | 9.447 | 10.595 | 14.058 | 18.991 | 12.446 | 14.888 | 14.94 |
| 12/12/2017 | 15.069 | 8.972 | 10.762 | 14.022 | 19.017 | 12.683 | 14.723 | 15.13 |
| 13/12/2017 | 15.147 | 9.247 | 10.629 | 14.032 | 18.981 | 12.569 | 14.803 | 15.116 |
| 14/12/2017 | 15.001 | 9.212 | 10.652 | 13.962 | 18.961 | 12.365 | 14.517 | 15.107 |
| 15/12/2017 | 15.077 | 9.302 | 10.607 | 13.92 | 19.125 | 12.395 | 14.785 | 15.1 |
| 16/12/2017 | 15.173 | 9.219 | 10.564 | 13.975 | 19.001 | 12.475 | 14.512 | 15.139 |
| 17/12/2017 | 15.135 | 9.35 | 10.62 | 14.087 | 18.898 | 12.439 | 14.444 | 15.003 |
| 18/12/2017 | 15.125 | 9.115 | 10.825 | 14.001 | 19.03 | 12.387 | 14.586 | 15.063 |
| 19/12/2017 | 15.113 | 9.12 | 10.747 | 13.959 | 18.944 | 12.52 | 14.451 | 15.194 |
| 20/12/2017 | 15.223 | 9.147 | 10.819 | 14.008 | 18.998 | 12.365 | 14.54 | 15.104 |
| 21/12/2017 | 15.162 | 9.211 | 10.777 | 13.967 | 19.199 | 12.647 | 14.568 | 15.069 |
| 22/12/2017 | 15.036 | 9.346 | 10.851 | 13.953 | 19.169 | 12.394 | 14.888 | 15.116 |
| 23/12/2017 | 15.139 | 9.167 | 10.836 | 13.995 | 19.08 | 12.371 | 14.549 | 15.269 |
| 24/12/2017 | 15.027 | 9.34 | 10.859 | 14.002 | 19.114 | 12.318 | 14.563 | 15.239 |
| 25/12/2017 | 15.078 | 9.289 | 10.829 | 13.952 | 19.144 | 12.205 | 14.438 | 15.045 |
| 26/12/2017 | 15.096 | 9.205 | 10.688 | 13.992 | 19.097 | 12.538 | 14.736 | 15.274 |
| 27/12/2017 | 15.183 | 9.044 | 10.941 | 13.941 | 19.075 | 12.258 | 14.671 | 15.339 |
| 28/12/2017 | 14.983 | 9.01 | 10.634 | 13.991 | 18.963 | 12.27 | 14.454 | 15.271 |
| 29/12/2017 | 14.979 | 9.115 | 10.704 | 13.841 | 19.015 | 12.469 | 14.586 | 15.229 |
| 30/12/2017 | 14.998 | 9.404 | 10.733 | 13.782 | 18.98 | 12.283 | 14.515 | 14.98 |
| 31/12/2017 | 15.037 | 9.248 | 10.662 | 13.852 | 19.168 | 12.417 | 14.61 | 14.994 |
| 01/01/2018 | 15.005 | 9.047 | 10.693 | 13.859 | 18.984 | 12.741 | 14.66 | 14.934 |
| 02/01/2018 | 14.998 | 8.976 | 10.825 | 13.863 | 19.055 | 12.466 | 14.816 | 15.056 |
| 03/01/2018 | 15.081 | 9.015 | 10.594 | 13.814 | 18.968 | 12.253 | 14.924 | 15.1 |
| 04/01/2018 | 15.025 | 8.95 | 10.618 | 13.763 | 19.102 | 12.239 | 14.753 | 14.924 |
| 05/01/2018 | 14.98 | 9.036 | 10.653 | 13.81 | 19.032 | 12.406 | 14.816 | 14.912 |
| 06/01/2018 | 15.161 | 8.995 | 10.617 | 13.863 | 19.072 | 12.498 | 14.588 | 14.829 |
| 07/01/2018 | 15.138 | 8.874 | 10.682 | 13.94 | 19.035 | 12.272 | 14.712 | 14.838 |
| 08/01/2018 | 15.037 | 9.063 | 10.788 | 13.997 | 19.209 | 12.363 | 14.849 | 15.064 |
| 09/01/2018 | 15.013 | 9.116 | 10.744 | 14.059 | 19.066 | 12.489 | 14.87 | 14.906 |
| 10/01/2018 | 15.11 | 9.15 | 10.601 | 13.92 | 19.206 | 12.556 | 14.849 | 14.967 |
| 11/01/2018 | 15.034 | 9.202 | 10.683 | 13.926 | 19.166 | 12.528 | 15.074 | 14.801 |
| 12/01/2018 | 15.199 | 9.053 | 10.769 | 13.984 | 19.061 | 12.662 | 14.869 | 14.946 |
| 13/01/2018 | 15.048 | 8.99 | 10.902 | 13.941 | 19.018 | 12.643 | 15.051 | 15.016 |
| 14/01/2018 | 15.266 | 9.144 | 10.93 | 13.936 | 18.936 | 12.404 | 14.864 | 14.858 |
| 15/01/2018 | 15.095 | 8.857 | 10.954 | 13.966 | 18.979 | 12.487 | 15.131 | 14.906 |
| 16/01/2018 | 14.947 | 8.983 | 10.847 | 13.942 | 18.956 | 12.452 | 14.911 | 14.927 |
| 17/01/2018 | 14.958 | 9.035 | 10.699 | 13.84 | 19.032 | 12.317 | 14.974 | 14.743 |
| 18/01/2018 | 15.031 | 9.29 | 10.57 | 13.91 | 18.953 | 12.253 | 14.856 | 14.773 |
| 19/01/2018 | 15.133 | 9.079 | 10.651 | 14.014 | 19.007 | 12.536 | 14.965 | 14.825 |
| 20/01/2018 | 15.106 | 9.158 | 10.557 | 14.002 | 18.947 | 12.259 | 14.801 | 14.832 |
| 21/01/2018 | 15.019 | 9.118 | 10.569 | 13.97 | 18.837 | 12.445 | 15.085 | 14.83 |
| 22/01/2018 | 14.977 | 9.041 | 10.478 | 13.943 | 18.923 | 12.48 | 15.044 | 14.831 |
| 23/01/2018 | 15.021 | 9.105 | 10.402 | 13.929 | 18.913 | 12.23 | 14.936 | 14.849 |
| 24/01/2018 | 15.044 | 9.264 | 10.673 | 13.954 | 18.747 | 12.27 | 14.968 | 14.907 |
| 25/01/2018 | 15.076 | 9.229 | 10.705 | 13.945 | 18.903 | 12.218 | 15.138 | 14.809 |
| 26/01/2018 | 15.014 | 9.202 | 10.809 | 13.987 | 18.997 | 12.26 | 14.98 | 14.897 |
| 27/01/2018 | 14.977 | 9.442 | 10.724 | 13.955 | 18.963 | 12.34 | 14.983 | 15.061 |
| 28/01/2018 | 15.104 | 9.167 | 10.632 | 13.95 | 18.858 | 12.217 | 14.988 | 15.029 |
| 29/01/2018 | 15.097 | 9.141 | 10.548 | 13.921 | 18.941 | 12.205 | 15.201 | 14.723 |
| 30/01/2018 | 15.057 | 9.142 | 10.47 | 13.907 | 19.075 | 12.151 | 15.098 | 14.698 |
| 31/01/2018 | 15.159 | 9.17 | 10.442 | 14.015 | 18.938 | 12.284 | 14.93 | 14.898 |
| 01/02/2018 | 15.171 | 9.333 | 10.479 | 13.955 | 18.912 | 12.232 | 15.144 | 14.881 |
| 02/02/2018 | 15.163 | 9.262 | 10.494 | 14.015 | 19.052 | 12.404 | 15.395 | 15.001 |
| 03/02/2018 | 15.156 | 9.36 | 10.54 | 14.059 | 18.974 | 12.368 | 15.238 | 15.107 |
| 04/02/2018 | 15.18 | 9.248 | 10.43 | 13.971 | 18.771 | 12.254 | 15.207 | 14.873 |
| 05/02/2018 | 15.167 | 9.177 | 10.502 | 14.066 | 18.995 | 12.296 | 15.238 | 14.915 |
| 06/02/2018 | 15.251 | 9.129 | 10.768 | 14.061 | 19.144 | 12.433 | 15.279 | 15.052 |
| 07/02/2018 | 15.204 | 9.299 | 10.627 | 14.087 | 19.035 | 12.378 | 15.231 | 15.168 |
| 08/02/2018 | 15.271 | 9.167 | 10.486 | 14.099 | 19.042 | 12.475 | 15.143 | 15.064 |
| 09/02/2018 | 15.193 | 9.039 | 10.543 | 14.053 | 18.943 | 12.677 | 15.207 | 14.851 |
| 10/02/2018 | 15.27 | 9.126 | 10.54 | 14.105 | 18.96 | 12.589 | 15.09 | 15.046 |
| 11/02/2018 | 15.2 | 8.966 | 10.391 | 13.978 | 18.868 | 12.228 | 15.055 | 14.831 |
| 12/02/2018 | 15.158 | 9.249 | 10.435 | 14.047 | 19.059 | 12.362 | 15.155 | 14.986 |
| 13/02/2018 | 15.157 | 9.063 | 10.592 | 14.092 | 19.056 | 12.49 | 15.091 | 15.006 |
| 14/02/2018 | 15.02 | 8.947 | 10.478 | 13.971 | 19.008 | 12.39 | 14.961 | 14.904 |
| 15/02/2018 | 14.986 | 9.091 | 10.472 | 13.938 | 18.886 | 12.182 | 15.212 | 14.886 |
| 16/02/2018 | 14.905 | 8.853 | 10.392 | 13.873 | 18.87 | 12.476 | 15.139 | 14.939 |
| 17/02/2018 | 15.049 | 9.057 | 10.366 | 13.778 | 18.855 | 12.549 | 14.997 | 14.839 |
| 18/02/2018 | 15.048 | 9.101 | 10.303 | 13.866 | 18.77 | 12.432 | 14.953 | 14.967 |
| 19/02/2018 | 14.878 | 8.986 | 10.261 | 13.973 | 18.871 | 12.551 | 15.031 | 14.977 |
| 20/02/2018 | 15.027 | 8.866 | 10.366 | 14.011 | 18.835 | 12.492 | 15.106 | 15.094 |
| 21/02/2018 | 15.02 | 9.105 | 10.546 | 14.051 | 18.945 | 12.693 | 15.16 | 15.182 |
| 22/02/2018 | 15.082 | 8.929 | 10.484 | 14.013 | 18.974 | 12.702 | 15.045 | 15.259 |
| 23/02/2018 | 15.199 | 8.901 | 10.495 | 14.191 | 19.022 | 12.709 | 15.369 | 15.33 |
| 24/02/2018 | 14.99 | 8.923 | 10.347 | 14.051 | 19.043 | 12.648 | 15.129 | 15.169 |
| 25/02/2018 | 15.052 | 8.833 | 10.46 | 14.045 | 18.985 | 12.632 | 15.126 | 15.109 |
| 26/02/2018 | 15.074 | 9.361 | 10.605 | 14.08 | 18.892 | 12.858 | 15.132 | 15.243 |
| 27/02/2018 | 15.103 | 9.078 | 10.522 | 14.061 | 18.991 | 12.524 | 15.268 | 15.216 |
| 28/02/2018 | 15.019 | 9.008 | 10.278 | 14.126 | 19.003 | 12.406 | 15.154 | 15.096 |
| 01/03/2018 | 15.117 | 8.769 | 10.313 | 14.08 | 19.162 | 12.531 | 15.136 | 15.18 |
| 02/03/2018 | 15.005 | 8.921 | 10.458 | 13.999 | 19.077 | 12.565 | 15.109 | 15.33 |
| 03/03/2018 | 15.02 | 8.829 | 10.455 | 13.831 | 19.07 | 12.441 | 14.967 | 14.947 |
| 04/03/2018 | 14.925 | 8.829 | 10.316 | 13.835 | 19.015 | 12.38 | 14.875 | 15.024 |
| 05/03/2018 | 14.974 | 8.847 | 10.46 | 13.871 | 19.143 | 12.417 | 14.963 | 14.929 |
| 06/03/2018 | 14.944 | 9.011 | 10.399 | 13.974 | 19.176 | 12.332 | 15.045 | 15.107 |
| 07/03/2018 | 14.999 | 8.882 | 10.475 | 14.023 | 19.138 | 12.642 | 15.036 | 15.294 |
| 08/03/2018 | 15.024 | 9.304 | 10.42 | 14.049 | 18.96 | 12.543 | 14.932 | 15.272 |
| 09/03/2018 | 15.076 | 8.884 | 10.399 | 14.011 | 19.087 | 12.36 | 14.949 | 15.269 |
| 10/03/2018 | 14.876 | 8.937 | 10.316 | 13.88 | 18.998 | 12.327 | 14.957 | 15.275 |
| 11/03/2018 | 15.123 | 8.984 | 10.61 | 13.895 | 19.076 | 12.429 | 15.072 | 15.122 |
| 12/03/2018 | 14.995 | 9.089 | 10.484 | 13.974 | 19.081 | 12.467 | 14.997 | 15.253 |
| 13/03/2018 | 14.796 | 9.081 | 10.402 | 13.963 | 19.007 | 12.405 | 15.038 | 15.279 |
| 14/03/2018 | 14.804 | 9.066 | 10.435 | 14.003 | 19.2 | 12.432 | 15.199 | 15.283 |
| 15/03/2018 | 15.079 | 9.151 | 10.558 | 14.007 | 19.21 | 12.27 | 15.102 | 15.299 |
| 16/03/2018 | 14.917 | 8.888 | 10.482 | 14.02 | 19.472 | 12.536 | 15.116 | 15.281 |
| 17/03/2018 | 14.937 | 8.95 | 10.398 | 13.988 | 19.491 | 12.463 | 15.024 | 15.103 |
| 18/03/2018 | 14.857 | 8.953 | 10.347 | 14.022 | 19.279 | 12.43 | 14.862 | 15.102 |
| 19/03/2018 | 15.062 | 9.139 | 10.419 | 14.018 | 19.533 | 12.545 | 15.016 | 15.12 |
| 20/03/2018 | 15.056 | 9.098 | 10.533 | 14.16 | 19.394 | 12.416 | 15.155 | 15.363 |
| 21/03/2018 | 15.111 | 8.968 | 10.691 | 14.167 | 19.335 | 12.626 | 15.155 | 15.279 |
| 22/03/2018 | 14.947 | 9.275 | 10.644 | 14.17 | 19.395 | 12.438 | 15.192 | 15.307 |
| 23/03/2018 | 14.908 | 9.311 | 10.642 | 14.132 | 19.377 | 12.42 | 15.196 | 15.279 |
| 24/03/2018 | 15.015 | 8.892 | 10.405 | 14.063 | 19.674 | 12.579 | 15.061 | 15.492 |
| 25/03/2018 | 15.174 | 9.098 | 10.367 | 14.05 | 19.31 | 12.395 | 15.119 | 15.132 |
| 26/03/2018 | 15.065 | 8.851 | 10.466 | 14.055 | 19.373 | 12.343 | 15.141 | 15.293 |
| 27/03/2018 | 14.879 | 9.069 | 10.177 | 13.979 | 19.23 | 12.459 | 15.224 | 15.285 |
| 28/03/2018 | 14.875 | 8.971 | 10.392 | 13.813 | 19.21 | 12.604 | 14.939 | 15.285 |
| 29/03/2018 | 14.848 | 9.039 | 10.357 | 13.845 | 19.288 | 12.55 | 15.074 | 15.236 |
| 30/03/2018 | 14.876 | 9.025 | 10.455 | 13.883 | 19.197 | 12.554 | 14.986 | 15.045 |
| 31/03/2018 | 15.035 | 9.197 | 10.387 | 13.942 | 19.259 | 12.59 | 14.848 | 14.997 |
| 01/04/2018 | 14.855 | 8.994 | 10.385 | 13.777 | 19.325 | 12.589 | 14.98 | 14.949 |
| 02/04/2018 | 14.927 | 8.998 | 10.414 | 13.848 | 19.194 | 12.552 | 14.943 | 15.093 |
| 03/04/2018 | 14.842 | 9.159 | 10.42 | 13.804 | 19.209 | 12.603 | 14.949 | 14.951 |
| 04/04/2018 | 14.864 | 9.008 | 10.334 | 13.794 | 19.335 | 12.557 | 15.118 | 15.16 |
| 05/04/2018 | 15.069 | 9.042 | 10.438 | 13.758 | 19.356 | 12.581 | 14.933 | 15.191 |
| 06/04/2018 | 14.874 | 9.057 | 10.41 | 13.88 | 19.37 | 12.472 | 15.188 | 15.21 |
| 07/04/2018 | 14.914 | 8.889 | 10.198 | 13.819 | 19.3 | 12.612 | 15.088 | 15.037 |
| 08/04/2018 | 14.873 | 9.005 | 10.208 | 13.812 | 19.338 | 12.492 | 14.938 | 15.064 |
| 09/04/2018 | 15.028 | 9.221 | 10.367 | 13.916 | 19.413 | 12.484 | 15.006 | 15.241 |
| 10/04/2018 | 14.969 | 9.143 | 10.264 | 13.991 | 19.429 | 12.435 | 15.097 | 15.229 |
| 11/04/2018 | 15.043 | 8.789 | 10.406 | 14.001 | 19.464 | 12.524 | 14.964 | 15.178 |
| 12/04/2018 | 15.034 | 8.973 | 10.314 | 13.945 | 19.37 | 12.535 | 15.102 | 15.293 |
| 13/04/2018 | 14.876 | 8.829 | 10.51 | 13.955 | 19.404 | 12.392 | 15.098 | 15.338 |
| 14/04/2018 | 14.991 | 9.178 | 10.588 | 13.921 | 19.405 | 12.618 | 15.132 | 15.239 |
| 15/04/2018 | 15.006 | 8.939 | 10.508 | 13.872 | 19.246 | 12.47 | 14.985 | 15.057 |
| 16/04/2018 | 15.089 | 8.943 | 10.588 | 13.892 | 19.406 | 12.528 | 15.114 | 15.256 |
| 17/04/2018 | 14.91 | 8.848 | 10.583 | 13.821 | 19.253 | 12.419 | 15.08 | 15.315 |
| 18/04/2018 | 14.858 | 9.002 | 10.63 | 13.735 | 19.367 | 12.506 | 15.126 | 15.215 |
| 19/04/2018 | 14.923 | 9.117 | 10.679 | 13.745 | 19.245 | 12.861 | 15.038 | 15.312 |
| 20/04/2018 | 14.899 | 9.085 | 10.639 | 13.736 | 19.371 | 12.506 | 15.07 | 15.325 |
| 21/04/2018 | 14.887 | 9.082 | 10.386 | 13.709 | 19.419 | 12.558 | 15.05 | 15.352 |
| 22/04/2018 | 14.81 | 9.254 | 10.441 | 13.632 | 19.309 | 12.433 | 14.957 | 15.07 |
| 23/04/2018 | 14.932 | 8.969 | 10.487 | 13.67 | 19.197 | 12.681 | 15.369 | 15.013 |
| 24/04/2018 | 14.935 | 8.947 | 10.521 | 13.642 | 19.186 | 12.534 | 15.255 | 15.071 |
| 25/04/2018 | 14.823 | 9.028 | 10.45 | 13.675 | 19.135 | 12.464 | 15.167 | 15.156 |
| 26/04/2018 | 14.914 | 9.001 | 10.421 | 13.798 | 19.237 | 12.484 | 15.17 | 15.322 |
| 27/04/2018 | 14.888 | 9.077 | 10.395 | 13.721 | 19.3 | 12.505 | 15.359 | 15.115 |
| 28/04/2018 | 14.964 | 9.205 | 10.504 | 13.735 | 19.211 | 12.666 | 15.284 | 15.142 |
| 29/04/2018 | 15.081 | 9.062 | 10.513 | 13.814 | 19.395 | 12.631 | 15.124 | 15.155 |
| 30/04/2018 | 14.935 | 9.095 | 10.532 | 13.86 | 19.333 | 12.738 | 15.352 | 15.159 |
| 01/05/2018 | 14.922 | 9.254 | 10.459 | 13.803 | 19.277 | 12.973 | 15.36 | 15.148 |
| 02/05/2018 | 15.156 | 9.558 | 10.525 | 13.882 | 19.386 | 12.413 | 15.233 | 15.158 |
| 03/05/2018 | 15.18 | 9.056 | 10.51 | 13.849 | 19.332 | 12.583 | 15.297 | 15.277 |
| 04/05/2018 | 15.097 | 9.05 | 10.44 | 13.951 | 19.32 | 12.808 | 15.376 | 15.341 |
| 05/05/2018 | 15.07 | 9.209 | 10.533 | 13.841 | 19.214 | 12.647 | 15.291 | 15.09 |
| 06/05/2018 | 15.065 | 8.956 | 10.453 | 13.708 | 19.153 | 12.502 | 15.238 | 15.035 |